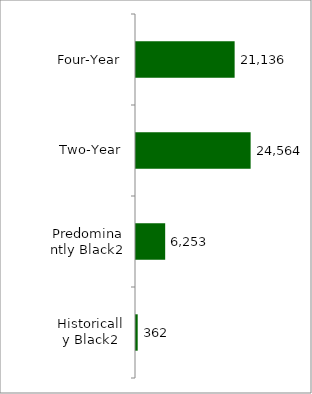
| Category | State |
|---|---|
| Four-Year | 21136 |
| Two-Year | 24564 |
| Predominantly Black2 | 6253 |
| Historically Black2 | 362 |